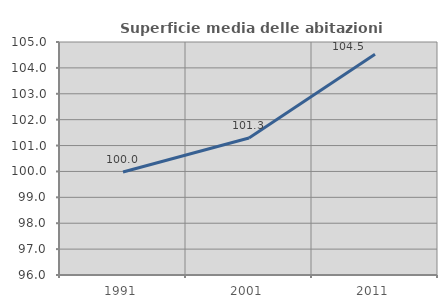
| Category | Superficie media delle abitazioni occupate |
|---|---|
| 1991.0 | 99.977 |
| 2001.0 | 101.292 |
| 2011.0 | 104.531 |